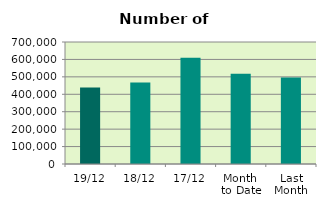
| Category | Series 0 |
|---|---|
| 19/12 | 438372 |
| 18/12 | 468330 |
| 17/12 | 610292 |
| Month 
to Date | 518137.714 |
| Last
Month | 495852.095 |